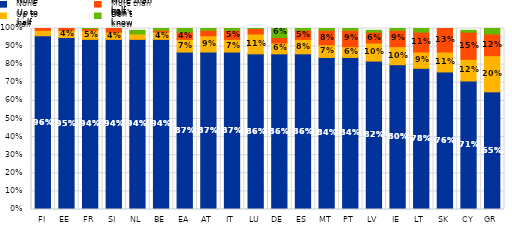
| Category | None | Up to half | More than half | Don't know |
|---|---|---|---|---|
| FI | 0.96 | 0.03 | 0.01 | 0 |
| EE | 0.95 | 0.04 | 0.01 | 0 |
| FR | 0.94 | 0.05 | 0.01 | 0.01 |
| SI | 0.94 | 0.04 | 0.02 | 0 |
| NL | 0.94 | 0.03 | 0 | 0.02 |
| BE | 0.94 | 0.04 | 0.01 | 0.01 |
| EA | 0.87 | 0.07 | 0.04 | 0.02 |
| AT | 0.87 | 0.09 | 0.03 | 0.01 |
| IT | 0.87 | 0.07 | 0.05 | 0.01 |
| LU | 0.86 | 0.11 | 0.03 | 0.01 |
| DE | 0.86 | 0.06 | 0.03 | 0.06 |
| ES | 0.86 | 0.08 | 0.05 | 0.01 |
| MT | 0.84 | 0.07 | 0.08 | 0.01 |
| PT | 0.84 | 0.06 | 0.09 | 0.01 |
| LV | 0.82 | 0.1 | 0.06 | 0.01 |
| IE | 0.8 | 0.1 | 0.09 | 0.02 |
| LT | 0.78 | 0.09 | 0.11 | 0.02 |
| SK | 0.76 | 0.11 | 0.13 | 0 |
| CY | 0.71 | 0.12 | 0.15 | 0.01 |
| GR | 0.65 | 0.2 | 0.12 | 0.03 |